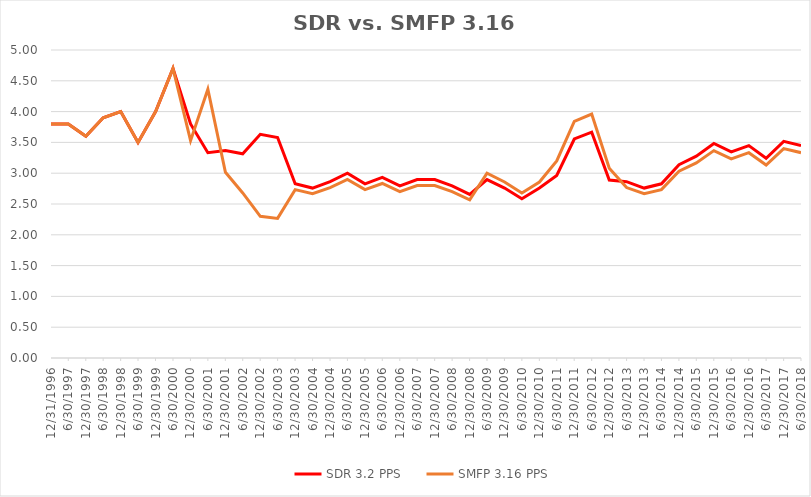
| Category | SDR 3.2 PPS | SMFP 3.16 PPS |
|---|---|---|
| 12/31/96 | 3.8 | 3.8 |
| 6/30/97 | 3.8 | 3.8 |
| 12/31/97 | 3.6 | 3.6 |
| 6/30/98 | 3.9 | 3.9 |
| 12/31/98 | 4 | 4 |
| 6/30/99 | 3.5 | 3.5 |
| 12/31/99 | 4 | 4 |
| 6/30/00 | 4.7 | 4.7 |
| 12/31/00 | 3.8 | 3.529 |
| 6/30/01 | 3.333 | 4.363 |
| 12/31/01 | 3.368 | 3.015 |
| 6/30/02 | 3.316 | 2.679 |
| 12/31/02 | 3.632 | 2.3 |
| 6/30/03 | 3.579 | 2.267 |
| 12/31/03 | 2.828 | 2.733 |
| 6/30/04 | 2.759 | 2.667 |
| 12/31/04 | 2.862 | 2.767 |
| 6/30/05 | 3 | 2.9 |
| 12/31/05 | 2.828 | 2.733 |
| 6/30/06 | 2.931 | 2.833 |
| 12/31/06 | 2.793 | 2.7 |
| 6/30/07 | 2.897 | 2.8 |
| 12/31/07 | 2.897 | 2.8 |
| 6/30/08 | 2.793 | 2.7 |
| 12/31/08 | 2.655 | 2.567 |
| 6/30/09 | 2.897 | 3 |
| 12/31/09 | 2.759 | 2.857 |
| 6/30/10 | 2.586 | 2.679 |
| 12/31/10 | 2.759 | 2.857 |
| 6/30/11 | 2.963 | 3.2 |
| 12/31/11 | 3.556 | 3.84 |
| 6/30/12 | 3.667 | 3.96 |
| 12/31/12 | 2.889 | 3.081 |
| 6/30/13 | 2.862 | 2.767 |
| 12/31/13 | 2.759 | 2.667 |
| 6/30/14 | 2.828 | 2.733 |
| 12/31/14 | 3.138 | 3.033 |
| 6/30/15 | 3.276 | 3.167 |
| 12/31/15 | 3.483 | 3.367 |
| 6/30/16 | 3.345 | 3.233 |
| 12/31/16 | 3.448 | 3.333 |
| 6/30/17 | 3.241 | 3.133 |
| 12/31/17 | 3.517 | 3.4 |
| 6/30/18 | 3.448 | 3.333 |